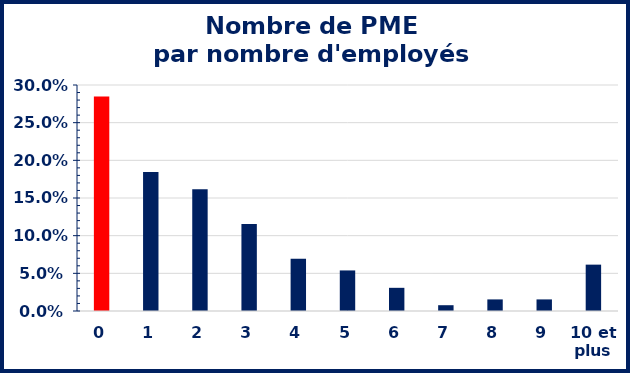
| Category | Series 0 |
|---|---|
| 0 | 0.285 |
| 1 | 0.185 |
| 2 | 0.162 |
| 3 | 0.115 |
| 4 | 0.069 |
| 5 | 0.054 |
| 6 | 0.031 |
| 7 | 0.008 |
| 8 | 0.015 |
| 9 | 0.015 |
| 10 et plus | 0.062 |